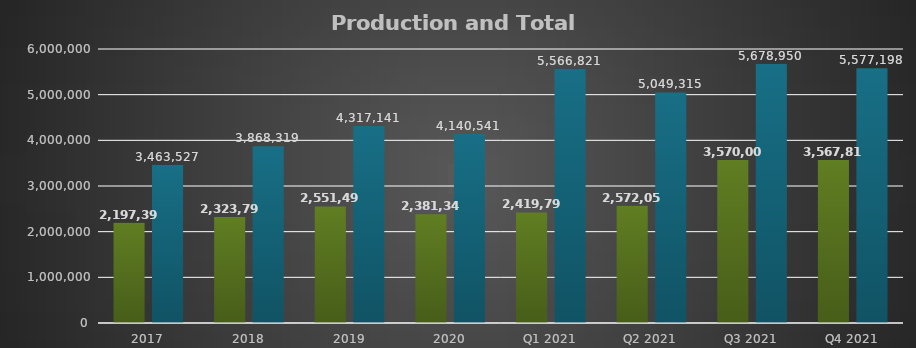
| Category | Production Ha | Total Ha* |
|---|---|---|
| 2017 | 2197395 | 3463527.49 |
| 2018 | 2323798.97 | 3868318.93 |
| 2019 | 2551499 | 4317141 |
| 2020 | 2381340.48 | 4140541.15 |
| Q1 2021 | 2419799 | 5566821.43 |
| Q2 2021 | 2572051 | 5049314.77 |
| Q3 2021 | 3570001 | 5678950 |
| Q4 2021 | 3567815 | 5577198 |